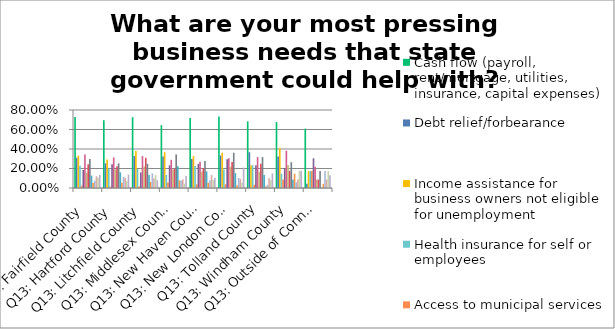
| Category | Cash flow (payroll, rent/mortgage, utilities, insurance, capital expenses) | Debt relief/forbearance | Income assistance for business owners not eligible for unemployment | Health insurance for self or employees | Access to municipal services | Assistance securing PPE or other supplies | Qualifying for federal SBA assistance | Clarification of federal and state mandates | Clarification of federal and state program offerings | Clarification on when non-essential business might resume | Reduce business expenses for layoffs | Help with moving business operations online | Improved broadband service/access | Increased communication and information from state government | Don’t know what assistance is available | Other (please specify) |
|---|---|---|---|---|---|---|---|---|---|---|---|---|---|---|---|---|
| Q13: Fairfield County | 0.728 | 0.311 | 0.332 | 0.229 | 0.024 | 0.186 | 0.345 | 0.157 | 0.243 | 0.296 | 0.128 | 0.051 | 0.075 | 0.12 | 0.106 | 0.135 |
| Q13: Hartford County | 0.695 | 0.253 | 0.293 | 0.198 | 0.014 | 0.244 | 0.313 | 0.192 | 0.224 | 0.253 | 0.161 | 0.055 | 0.115 | 0.103 | 0.069 | 0.138 |
| Q13: Litchfield County | 0.726 | 0.327 | 0.38 | 0.195 | 0.018 | 0.159 | 0.327 | 0.221 | 0.31 | 0.248 | 0.133 | 0.062 | 0.15 | 0.097 | 0.133 | 0.08 |
| Q13: Middlesex County | 0.644 | 0.322 | 0.367 | 0.133 | 0.056 | 0.233 | 0.289 | 0.189 | 0.2 | 0.344 | 0.222 | 0.078 | 0.078 | 0.089 | 0.044 | 0.122 |
| Q13: New Haven County | 0.718 | 0.298 | 0.327 | 0.226 | 0.037 | 0.247 | 0.269 | 0.168 | 0.205 | 0.277 | 0.17 | 0.053 | 0.08 | 0.133 | 0.082 | 0.104 |
| Q13: New London County | 0.733 | 0.333 | 0.362 | 0.19 | 0.038 | 0.295 | 0.305 | 0.219 | 0.267 | 0.362 | 0.152 | 0.029 | 0.105 | 0.095 | 0.057 | 0.21 |
| Q13: Tolland County | 0.683 | 0.367 | 0.233 | 0.233 | 0.033 | 0.233 | 0.317 | 0.167 | 0.25 | 0.317 | 0.133 | 0.017 | 0.033 | 0.1 | 0.083 | 0.15 |
| Q13: Windham County | 0.677 | 0.324 | 0.412 | 0.147 | 0.088 | 0.206 | 0.382 | 0.235 | 0.176 | 0.265 | 0.088 | 0.147 | 0.059 | 0.088 | 0.176 | 0.176 |
| Q13: Outside of Connecticut | 0.609 | 0.044 | 0.174 | 0.174 | 0.174 | 0.304 | 0.217 | 0.087 | 0.087 | 0.174 | 0 | 0.044 | 0.174 | 0.087 | 0.174 | 0.13 |